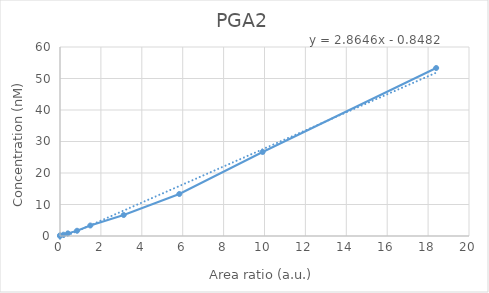
| Category | PGA2 |
|---|---|
| 0.0 | 0 |
| 0.000336524848857799 | 0.208 |
| 0.170369484011703 | 0.417 |
| 0.38447447367772 | 0.833 |
| 0.833938027819071 | 1.667 |
| 1.48350504207162 | 3.333 |
| 3.11521467326628 | 6.667 |
| 5.83474062431892 | 13.333 |
| 9.90799574406183 | 26.667 |
| 18.3944832121861 | 53.333 |